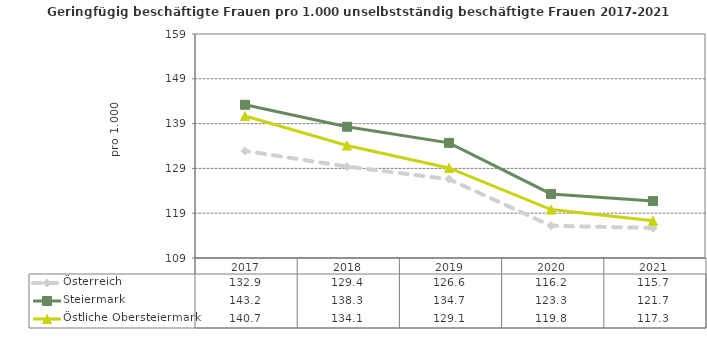
| Category | Österreich | Steiermark | Östliche Obersteiermark |
|---|---|---|---|
| 2021.0 | 115.7 | 121.7 | 117.3 |
| 2020.0 | 116.2 | 123.3 | 119.8 |
| 2019.0 | 126.6 | 134.7 | 129.1 |
| 2018.0 | 129.4 | 138.3 | 134.1 |
| 2017.0 | 132.9 | 143.2 | 140.7 |